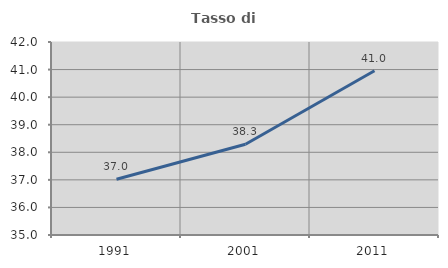
| Category | Tasso di occupazione   |
|---|---|
| 1991.0 | 37.025 |
| 2001.0 | 38.293 |
| 2011.0 | 40.958 |